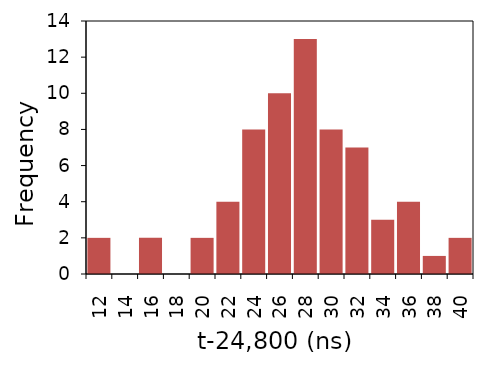
| Category | Series 1 |
|---|---|
| 12.0 | 2 |
| 14.0 | 0 |
| 16.0 | 2 |
| 18.0 | 0 |
| 20.0 | 2 |
| 22.0 | 4 |
| 24.0 | 8 |
| 26.0 | 10 |
| 28.0 | 13 |
| 30.0 | 8 |
| 32.0 | 7 |
| 34.0 | 3 |
| 36.0 | 4 |
| 38.0 | 1 |
| 40.0 | 2 |